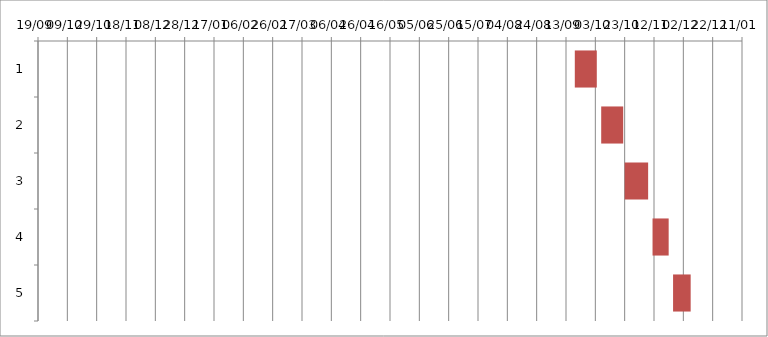
| Category | Fecha de inicio | DURACIÓN |
|---|---|---|
| 0 | 9/19/20 | 15 |
| 1 | 10/7/20 | 15 |
| 2 | 10/23/20 | 16 |
| 3 | 11/11/20 | 11 |
| 4 | 11/25/20 | 12 |